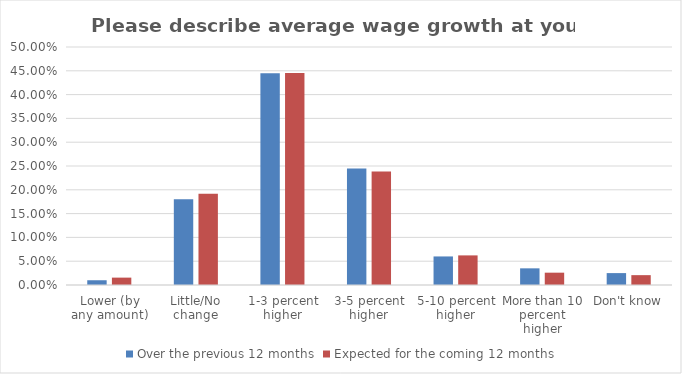
| Category | Over the previous 12 months | Expected for the coming 12 months |
|---|---|---|
| Lower (by any amount) | 0.01 | 0.016 |
| Little/No change | 0.18 | 0.192 |
| 1-3 percent higher | 0.445 | 0.446 |
| 3-5 percent higher | 0.245 | 0.238 |
| 5-10 percent higher | 0.06 | 0.062 |
| More than 10 percent higher | 0.035 | 0.026 |
| Don't know | 0.025 | 0.021 |